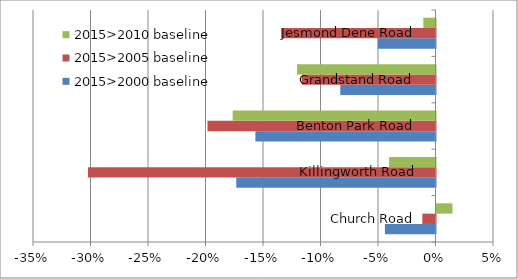
| Category | 2015>2000 baseline | 2015>2005 baseline | 2015>2010 baseline |
|---|---|---|---|
| Church Road | -0.044 | -0.011 | 0.014 |
| Killingworth Road | -0.173 | -0.302 | -0.04 |
| Benton Park Road | -0.157 | -0.198 | -0.176 |
| Grandstand Road | -0.083 | -0.116 | -0.12 |
| Jesmond Dene Road | -0.05 | -0.134 | -0.011 |